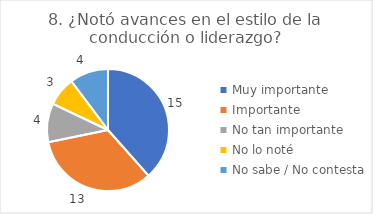
| Category | 8. ¿Notó avances en el estilo de la conducción o liderazgo? |
|---|---|
| Muy importante  | 0.385 |
| Importante  | 0.333 |
| No tan importante  | 0.103 |
| No lo noté  | 0.077 |
| No sabe / No contesta | 0.103 |